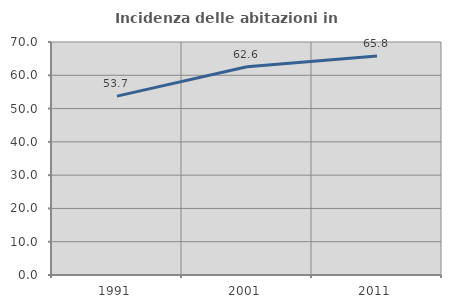
| Category | Incidenza delle abitazioni in proprietà  |
|---|---|
| 1991.0 | 53.747 |
| 2001.0 | 62.569 |
| 2011.0 | 65.794 |